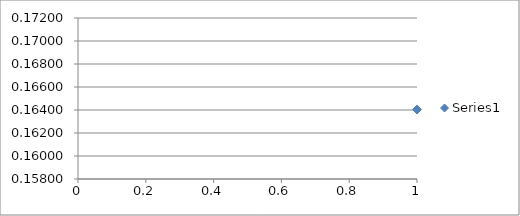
| Category | Series 0 |
|---|---|
| 0 | 0.164 |
| 1 | 0.162 |
| 2 | 0.163 |
| 3 | 0.163 |
| 4 | 0.168 |
| 5 | 0.169 |
| 6 | 0.163 |
| 7 | 0.165 |
| 8 | 0.168 |
| 9 | 0.168 |
| 10 | 0.163 |
| 11 | 0.162 |
| 12 | 0.161 |
| 13 | 0.166 |
| 14 | 0.165 |
| 15 | 0.169 |
| 16 | 0.166 |
| 17 | 0.166 |
| 18 | 0.168 |
| 19 | 0.169 |
| 20 | 0.164 |
| 21 | 0.16 |
| 22 | 0.16 |
| 23 | 0.161 |
| 24 | 0.165 |
| 25 | 0.16 |
| 26 | 0.169 |
| 27 | 0.161 |
| 28 | 0.169 |
| 29 | 0.162 |
| 30 | 0.169 |
| 31 | 0.166 |
| 32 | 0.163 |
| 33 | 0.164 |
| 34 | 0.166 |
| 35 | 0.169 |
| 36 | 0.167 |
| 37 | 0.168 |
| 38 | 0.163 |
| 39 | 0.165 |
| 40 | 0.166 |
| 41 | 0.166 |
| 42 | 0.168 |
| 43 | 0.162 |
| 44 | 0.169 |
| 45 | 0.166 |
| 46 | 0.167 |
| 47 | 0.162 |
| 48 | 0.164 |
| 49 | 0.166 |
| 50 | 0.164 |
| 51 | 0.168 |
| 52 | 0.162 |
| 53 | 0.162 |
| 54 | 0.17 |
| 55 | 0.165 |
| 56 | 0.167 |
| 57 | 0.165 |
| 58 | 0.166 |
| 59 | 0.162 |
| 60 | 0.161 |
| 61 | 0.17 |
| 62 | 0.161 |
| 63 | 0.169 |
| 64 | 0.17 |
| 65 | 0.167 |
| 66 | 0.162 |
| 67 | 0.163 |
| 68 | 0.167 |
| 69 | 0.164 |
| 70 | 0.164 |
| 71 | 0.161 |
| 72 | 0.163 |
| 73 | 0.162 |
| 74 | 0.169 |
| 75 | 0.165 |
| 76 | 0.16 |
| 77 | 0.169 |
| 78 | 0.162 |
| 79 | 0.162 |
| 80 | 0.167 |
| 81 | 0.17 |
| 82 | 0.164 |
| 83 | 0.163 |
| 84 | 0.161 |
| 85 | 0.161 |
| 86 | 0.16 |
| 87 | 0.169 |
| 88 | 0.16 |
| 89 | 0.167 |
| 90 | 0.164 |
| 91 | 0.161 |
| 92 | 0.161 |
| 93 | 0.168 |
| 94 | 0.166 |
| 95 | 0.167 |
| 96 | 0.162 |
| 97 | 0.164 |
| 98 | 0.168 |
| 99 | 0.168 |
| 100 | 0.166 |
| 101 | 0.164 |
| 102 | 0.163 |
| 103 | 0.166 |
| 104 | 0.164 |
| 105 | 0.166 |
| 106 | 0.161 |
| 107 | 0.162 |
| 108 | 0.161 |
| 109 | 0.16 |
| 110 | 0.163 |
| 111 | 0.162 |
| 112 | 0.165 |
| 113 | 0.166 |
| 114 | 0.164 |
| 115 | 0.162 |
| 116 | 0.163 |
| 117 | 0.163 |
| 118 | 0.166 |
| 119 | 0.168 |
| 120 | 0.161 |
| 121 | 0.161 |
| 122 | 0.167 |
| 123 | 0.166 |
| 124 | 0.164 |
| 125 | 0.162 |
| 126 | 0.162 |
| 127 | 0.161 |
| 128 | 0.162 |
| 129 | 0.164 |
| 130 | 0.163 |
| 131 | 0.163 |
| 132 | 0.162 |
| 133 | 0.161 |
| 134 | 0.163 |
| 135 | 0.17 |
| 136 | 0.162 |
| 137 | 0.168 |
| 138 | 0.162 |
| 139 | 0.169 |
| 140 | 0.16 |
| 141 | 0.166 |
| 142 | 0.164 |
| 143 | 0.166 |
| 144 | 0.166 |
| 145 | 0.169 |
| 146 | 0.168 |
| 147 | 0.163 |
| 148 | 0.168 |
| 149 | 0.165 |
| 150 | 0.169 |
| 151 | 0.166 |
| 152 | 0.16 |
| 153 | 0.16 |
| 154 | 0.167 |
| 155 | 0.161 |
| 156 | 0.162 |
| 157 | 0.169 |
| 158 | 0.168 |
| 159 | 0.164 |
| 160 | 0.165 |
| 161 | 0.162 |
| 162 | 0.167 |
| 163 | 0.168 |
| 164 | 0.161 |
| 165 | 0.168 |
| 166 | 0.162 |
| 167 | 0.164 |
| 168 | 0.166 |
| 169 | 0.163 |
| 170 | 0.163 |
| 171 | 0.166 |
| 172 | 0.168 |
| 173 | 0.165 |
| 174 | 0.168 |
| 175 | 0.162 |
| 176 | 0.16 |
| 177 | 0.168 |
| 178 | 0.169 |
| 179 | 0.164 |
| 180 | 0.167 |
| 181 | 0.167 |
| 182 | 0.16 |
| 183 | 0.161 |
| 184 | 0.166 |
| 185 | 0.165 |
| 186 | 0.166 |
| 187 | 0.162 |
| 188 | 0.161 |
| 189 | 0.163 |
| 190 | 0.161 |
| 191 | 0.164 |
| 192 | 0.168 |
| 193 | 0.163 |
| 194 | 0.167 |
| 195 | 0.161 |
| 196 | 0.161 |
| 197 | 0.165 |
| 198 | 0.168 |
| 199 | 0.169 |
| 200 | 0.162 |
| 201 | 0.168 |
| 202 | 0.162 |
| 203 | 0.169 |
| 204 | 0.17 |
| 205 | 0.163 |
| 206 | 0.165 |
| 207 | 0.168 |
| 208 | 0.17 |
| 209 | 0.17 |
| 210 | 0.166 |
| 211 | 0.169 |
| 212 | 0.168 |
| 213 | 0.165 |
| 214 | 0.162 |
| 215 | 0.165 |
| 216 | 0.169 |
| 217 | 0.164 |
| 218 | 0.168 |
| 219 | 0.168 |
| 220 | 0.16 |
| 221 | 0.16 |
| 222 | 0.169 |
| 223 | 0.169 |
| 224 | 0.163 |
| 225 | 0.167 |
| 226 | 0.166 |
| 227 | 0.167 |
| 228 | 0.162 |
| 229 | 0.164 |
| 230 | 0.163 |
| 231 | 0.165 |
| 232 | 0.166 |
| 233 | 0.168 |
| 234 | 0.164 |
| 235 | 0.161 |
| 236 | 0.164 |
| 237 | 0.166 |
| 238 | 0.165 |
| 239 | 0.169 |
| 240 | 0.162 |
| 241 | 0.167 |
| 242 | 0.163 |
| 243 | 0.162 |
| 244 | 0.166 |
| 245 | 0.162 |
| 246 | 0.163 |
| 247 | 0.166 |
| 248 | 0.165 |
| 249 | 0.17 |
| 250 | 0.169 |
| 251 | 0.166 |
| 252 | 0.166 |
| 253 | 0.161 |
| 254 | 0.164 |
| 255 | 0.17 |
| 256 | 0.166 |
| 257 | 0.166 |
| 258 | 0.166 |
| 259 | 0.165 |
| 260 | 0.165 |
| 261 | 0.16 |
| 262 | 0.162 |
| 263 | 0.162 |
| 264 | 0.165 |
| 265 | 0.164 |
| 266 | 0.163 |
| 267 | 0.16 |
| 268 | 0.167 |
| 269 | 0.16 |
| 270 | 0.165 |
| 271 | 0.168 |
| 272 | 0.164 |
| 273 | 0.169 |
| 274 | 0.168 |
| 275 | 0.163 |
| 276 | 0.162 |
| 277 | 0.163 |
| 278 | 0.17 |
| 279 | 0.165 |
| 280 | 0.162 |
| 281 | 0.164 |
| 282 | 0.169 |
| 283 | 0.164 |
| 284 | 0.17 |
| 285 | 0.166 |
| 286 | 0.169 |
| 287 | 0.164 |
| 288 | 0.163 |
| 289 | 0.167 |
| 290 | 0.169 |
| 291 | 0.17 |
| 292 | 0.166 |
| 293 | 0.164 |
| 294 | 0.168 |
| 295 | 0.164 |
| 296 | 0.166 |
| 297 | 0.168 |
| 298 | 0.161 |
| 299 | 0.162 |
| 300 | 0.169 |
| 301 | 0.165 |
| 302 | 0.17 |
| 303 | 0.164 |
| 304 | 0.17 |
| 305 | 0.163 |
| 306 | 0.162 |
| 307 | 0.165 |
| 308 | 0.168 |
| 309 | 0.169 |
| 310 | 0.169 |
| 311 | 0.163 |
| 312 | 0.161 |
| 313 | 0.168 |
| 314 | 0.168 |
| 315 | 0.167 |